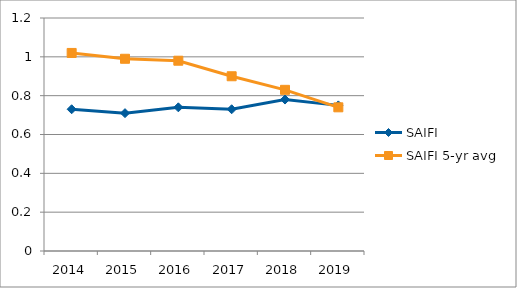
| Category | SAIFI | SAIFI 5-yr avg |
|---|---|---|
| 2014.0 | 0.73 | 1.02 |
| 2015.0 | 0.71 | 0.99 |
| 2016.0 | 0.74 | 0.98 |
| 2017.0 | 0.73 | 0.9 |
| 2018.0 | 0.78 | 0.83 |
| 2019.0 | 0.75 | 0.74 |